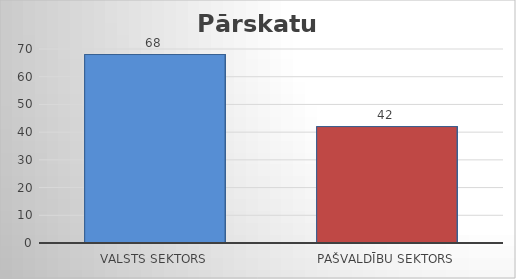
| Category | Series 0 |
|---|---|
| Valsts sektors | 68 |
| Pašvaldību sektors | 42 |